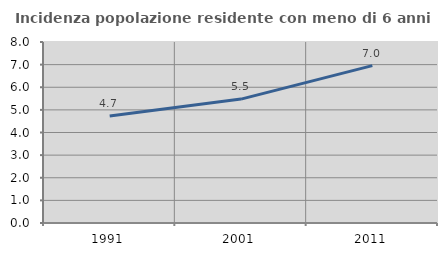
| Category | Incidenza popolazione residente con meno di 6 anni |
|---|---|
| 1991.0 | 4.73 |
| 2001.0 | 5.476 |
| 2011.0 | 6.957 |